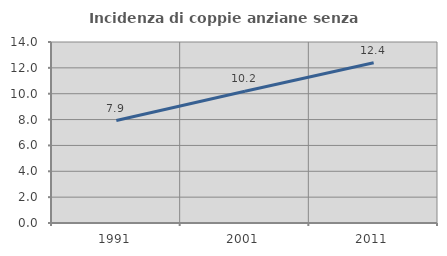
| Category | Incidenza di coppie anziane senza figli  |
|---|---|
| 1991.0 | 7.927 |
| 2001.0 | 10.184 |
| 2011.0 | 12.394 |